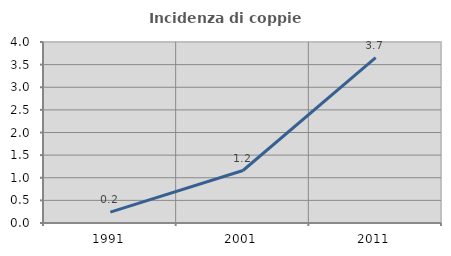
| Category | Incidenza di coppie miste |
|---|---|
| 1991.0 | 0.239 |
| 2001.0 | 1.16 |
| 2011.0 | 3.653 |